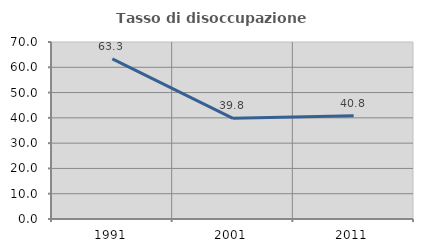
| Category | Tasso di disoccupazione giovanile  |
|---|---|
| 1991.0 | 63.325 |
| 2001.0 | 39.806 |
| 2011.0 | 40.796 |